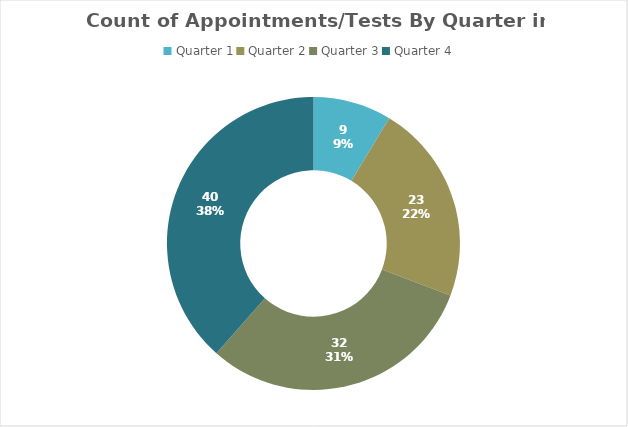
| Category | Count of Appointments/Tests |
|---|---|
| Quarter 1 | 9 |
| Quarter 2 | 23 |
| Quarter 3 | 32 |
| Quarter 4 | 40 |